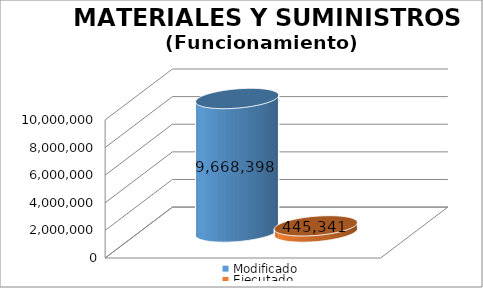
| Category | Modificado | Ejecutado |
|---|---|---|
| 0 | 9668398 | 445340.51 |